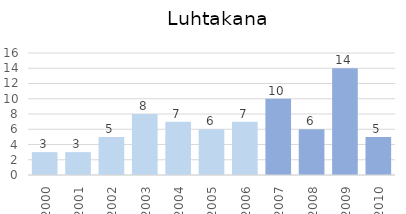
| Category | Series 0 |
|---|---|
| 2000.0 | 3 |
| 2001.0 | 3 |
| 2002.0 | 5 |
| 2003.0 | 8 |
| 2004.0 | 7 |
| 2005.0 | 6 |
| 2006.0 | 7 |
| 2007.0 | 10 |
| 2008.0 | 6 |
| 2009.0 | 14 |
| 2010.0 | 5 |